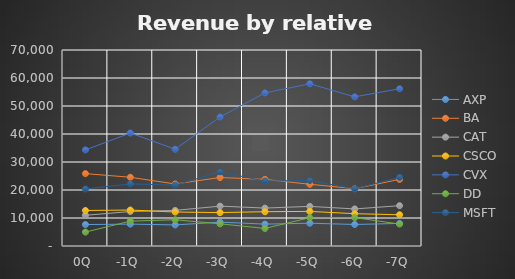
| Category | AXP | BA | CAT | CSCO | CVX | DD | MSFT |
|---|---|---|---|---|---|---|---|
| 0Q | 7664 | 25849 | 10962 | 12682 | 34315 | 4971 | 20379 |
| -1Q | 7817 | 24543 | 12317 | 12843 | 40357 | 8878 | 22180 |
| -2Q | 7530 | 22149 | 12702 | 12137 | 34558 | 9370 | 21729 |
| -3Q | 8525 | 24468 | 14244 | 11936 | 46088 | 7919 | 26470 |
| -4Q | 7815 | 23784 | 13549 | 12245 | 54679 | 6269 | 23201 |
| -5Q | 8142 | 22045 | 14150 | 12357 | 57938 | 10114 | 23382 |
| -6Q | 7688 | 20465 | 13241 | 11545 | 53265 | 10145 | 20403 |
| -7Q | 8068 | 23785 | 14402 | 11155 | 56158 | 7836 | 24519 |